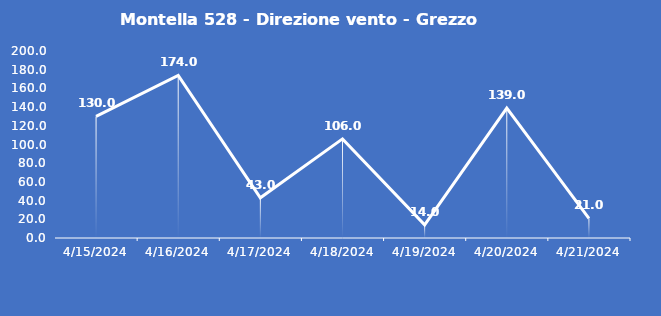
| Category | Montella 528 - Direzione vento - Grezzo (°N) |
|---|---|
| 4/15/24 | 130 |
| 4/16/24 | 174 |
| 4/17/24 | 43 |
| 4/18/24 | 106 |
| 4/19/24 | 14 |
| 4/20/24 | 139 |
| 4/21/24 | 21 |